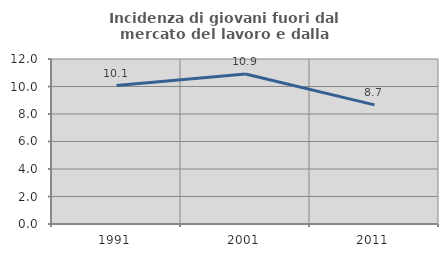
| Category | Incidenza di giovani fuori dal mercato del lavoro e dalla formazione  |
|---|---|
| 1991.0 | 10.067 |
| 2001.0 | 10.909 |
| 2011.0 | 8.661 |